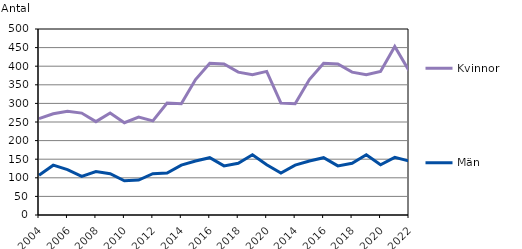
| Category | Kvinnor | Män |
|---|---|---|
| 2004 | 259 | 107 |
| 2005 | 272 | 134 |
| 2006 | 279 | 122 |
| 2007 | 274 | 104 |
| 2008 | 251 | 117 |
| 2009 | 274 | 111 |
| 2010 | 248 | 92 |
| 2011 | 263 | 94 |
| 2012 | 253 | 111 |
| 2013 | 301 | 113 |
| 2014 | 299 | 134 |
| 2015 | 364 | 145 |
| 2016 | 408 | 154 |
| 2017 | 406 | 132 |
| 2018 | 384 | 139 |
| 2019 | 377 | 162 |
| 2020 | 386 | 135 |
| 2013 | 301 | 113 |
| 2014 | 299 | 134 |
| 2015 | 364 | 145 |
| 2016 | 408 | 154 |
| 2017 | 406 | 132 |
| 2018 | 384 | 139 |
| 2019 | 377 | 162 |
| 2020 | 386 | 135 |
| 2021 | 453 | 155 |
| 2022 | 388 | 145 |